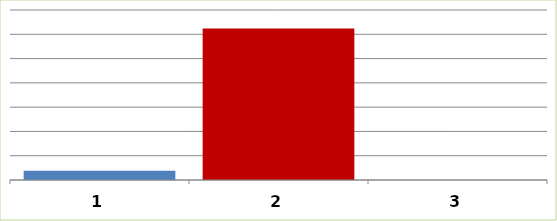
| Category | Series 0 |
|---|---|
| 0 | 3835150 |
| 1 | 62404850 |
| 2 | 0 |